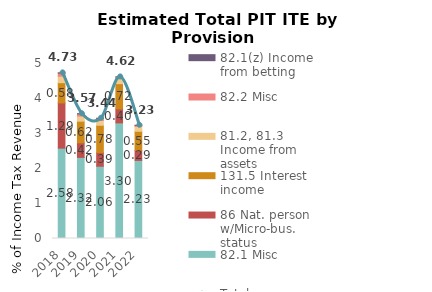
| Category | 82.1 Misc | 86 Nat. person w/Micro-bus. status | 131.5 Interest income  | 81.2, 81.3 Income from assets | 82.2 Misc | 82.1(z) Income from betting |
|---|---|---|---|---|---|---|
| 2018.0 | 2.581 | 1.293 | 0.578 | 0.185 | 0.089 | 0.007 |
| 2019.0 | 2.317 | 0.417 | 0.617 | 0.149 | 0.062 | 0.003 |
| 2020.0 | 2.064 | 0.389 | 0.782 | 0.138 | 0.06 | 0.002 |
| 2021.0 | 3.303 | 0.4 | 0.721 | 0.141 | 0.05 | 0.002 |
| 2022.0 | 2.231 | 0.286 | 0.547 | 0.141 | 0.029 | 0.001 |